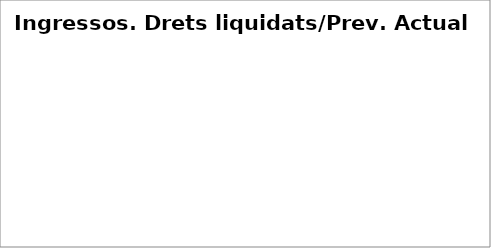
| Category | Series 0 |
|---|---|
| Impostos directes | 0.378 |
| Impostos indirectes | 0.377 |
| Taxes, preus públics i altres ingressos | 0.323 |
| Transferències corrents | 0.408 |
| Ingressos patrimonials | 0.168 |
| Venda d'inversions reals | 1.155 |
| Transferències de capital | 0.064 |
| Actius financers* | 0 |
| Passius financers | 0.013 |